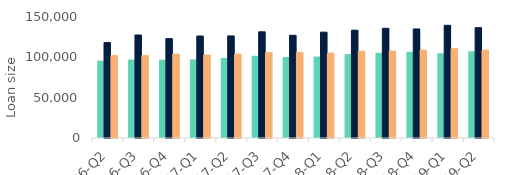
| Category | First-time
buyers | Homemovers | Homowner remortgaging |
|---|---|---|---|
| 16-Q2 | 95775.786 | 118334.003 | 102119.717 |
| 16-Q3 | 97252.16 | 127690.667 | 102191.498 |
| 16-Q4 | 97154.948 | 123212.854 | 104021.343 |
| 17-Q1 | 97385.72 | 126441.442 | 102905.018 |
| 17-Q2 | 99255.142 | 126554.429 | 103992.196 |
| 17-Q3 | 101912.638 | 131664.935 | 105788.294 |
| 17-Q4 | 100358.144 | 127325.73 | 105948.004 |
| 18-Q1 | 100940.766 | 131211.952 | 105266.056 |
| 18-Q2 | 103984.086 | 133651.193 | 107600.58 |
| 18-Q3 | 105574.269 | 135991.462 | 107745.815 |
| 18-Q4 | 106886.522 | 135182.606 | 108986.664 |
| 19-Q1 | 105140.753 | 139714.152 | 110705.872 |
| 19-Q2 | 107538.796 | 136744.351 | 108923.267 |